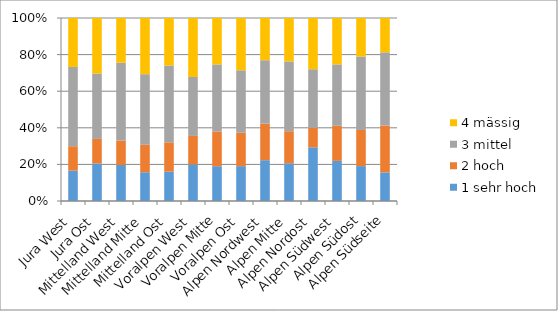
| Category | 1 sehr hoch | 2 hoch | 3 mittel | 4 mässig |
|---|---|---|---|---|
| Jura West | 26 | 21 | 68 | 42 |
| Jura Ost | 23 | 15 | 40 | 34 |
| Mittelland West | 25 | 17 | 54 | 31 |
| Mittelland Mitte | 22 | 21 | 54 | 43 |
| Mittelland Ost | 21 | 21 | 55 | 34 |
| Voralpen West | 18 | 14 | 29 | 29 |
| Voralpen Mitte | 27 | 27 | 52 | 36 |
| Voralpen Ost | 24 | 23 | 43 | 36 |
| Alpen Nordwest | 29 | 26 | 45 | 30 |
| Alpen Mitte | 20 | 17 | 37 | 23 |
| Alpen Nordost | 22 | 8 | 24 | 21 |
| Alpen Südwest | 32 | 28 | 49 | 37 |
| Alpen Südost | 29 | 30 | 61 | 32 |
| Alpen Südseite | 25 | 41 | 64 | 30 |